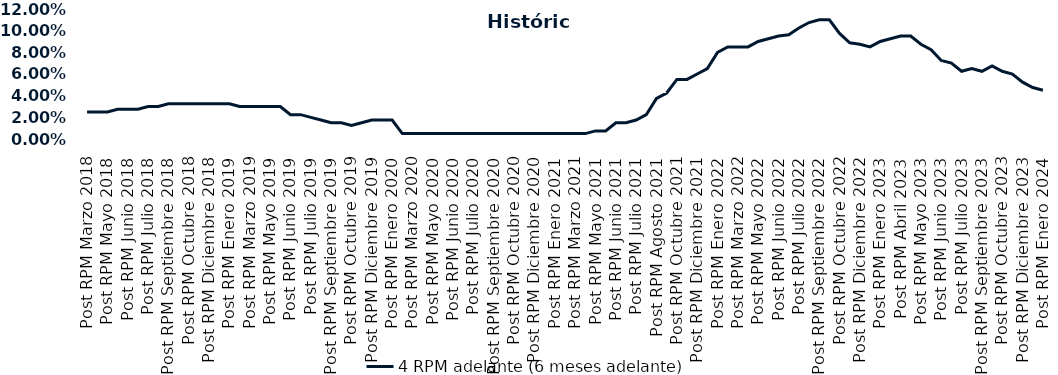
| Category | 4 RPM adelante (6 meses adelante) |
|---|---|
| Post RPM Marzo 2018 | 0.025 |
| Pre RPM Mayo 2018 | 0.025 |
| Post RPM Mayo 2018 | 0.025 |
| Pre RPM Junio 2018 | 0.028 |
| Post RPM Junio 2018 | 0.028 |
| Pre RPM Julio 2018 | 0.028 |
| Post RPM Julio 2018 | 0.03 |
| Pre RPM Septiembre 2018 | 0.03 |
| Post RPM Septiembre 2018 | 0.032 |
| Pre RPM Octubre 2018 | 0.032 |
| Post RPM Octubre 2018 | 0.032 |
| Pre RPM Diciembre 2018 | 0.032 |
| Post RPM Diciembre 2018 | 0.032 |
| Pre RPM Enero 2019 | 0.032 |
| Post RPM Enero 2019 | 0.032 |
| Pre RPM Marzo 2019 | 0.03 |
| Post RPM Marzo 2019 | 0.03 |
| Pre RPM Mayo 2019 | 0.03 |
| Post RPM Mayo 2019 | 0.03 |
| Pre RPM Junio 2019 | 0.03 |
| Post RPM Junio 2019 | 0.022 |
| Pre RPM Julio 2019 | 0.022 |
| Post RPM Julio 2019 | 0.02 |
| Pre RPM Septiembre 2019 | 0.018 |
| Post RPM Septiembre 2019 | 0.015 |
| Pre RPM Octubre 2019 | 0.015 |
| Post RPM Octubre 2019 | 0.012 |
| Pre RPM Diciembre 2019 | 0.015 |
| Post RPM Diciembre 2019 | 0.018 |
| Pre RPM Enero 2020 | 0.018 |
| Post RPM Enero 2020 | 0.018 |
| Pre RPM Marzo 2020 | 0.005 |
| Post RPM Marzo 2020 | 0.005 |
| Pre RPM Mayo 2020 | 0.005 |
| Post RPM Mayo 2020 | 0.005 |
| Pre RPM Junio 2020 | 0.005 |
| Post RPM Junio 2020 | 0.005 |
| Pre RPM Julio 2020 | 0.005 |
| Post RPM Julio 2020 | 0.005 |
| Pre RPM Septiembre 2020 | 0.005 |
| Post RPM Septiembre 2020 | 0.005 |
| Pre RPM Octubre 2020 | 0.005 |
| Post RPM Octubre 2020 | 0.005 |
| Pre RPM Diciembre 2020 | 0.005 |
| Post RPM Diciembre 2020 | 0.005 |
| Pre RPM Enero 2021 | 0.005 |
| Post RPM Enero 2021 | 0.005 |
| Pre RPM Marzo 2021 | 0.005 |
| Post RPM Marzo 2021 | 0.005 |
| Pre RPM Mayo 2021 | 0.005 |
| Post RPM Mayo 2021 | 0.008 |
| Pre RPM Junio 2021 | 0.008 |
| Post RPM Junio 2021 | 0.015 |
| Pre RPM Julio 2021 | 0.015 |
| Post RPM Julio 2021 | 0.018 |
| Pre RPM Agosto 2021 | 0.022 |
| Post RPM Agosto 2021 | 0.038 |
| Pre RPM Octubre 2021 | 0.042 |
| Post RPM Octubre 2021 | 0.055 |
| Pre RPM Diciembre 2021 | 0.055 |
| Post RPM Diciembre 2021 | 0.06 |
| Pre RPM Enero 2022 | 0.065 |
| Post RPM Enero 2022 | 0.08 |
| Pre RPM Marzo 2022 | 0.085 |
| Post RPM Marzo 2022 | 0.085 |
| Pre RPM Mayo 2022 | 0.085 |
| Post RPM Mayo 2022 | 0.09 |
| Pre RPM Junio 2022 | 0.092 |
| Post RPM Junio 2022 | 0.095 |
| Pre RPM Julio 2022 | 0.096 |
| Post RPM Julio 2022 | 0.102 |
| Pre RPM Septiembre 2022 | 0.108 |
| Post RPM Septiembre 2022 | 0.11 |
| Pre RPM Octubre 2022 | 0.11 |
| Post RPM Octubre 2022 | 0.098 |
| Pre RPM Diciembre 2022 | 0.089 |
| Post RPM Diciembre 2022 | 0.088 |
| Pre RPM Enero 2023 | 0.085 |
| Post RPM Enero 2023 | 0.09 |
| Pre RPM Abril 2023 | 0.092 |
| Post RPM Abril 2023 | 0.095 |
| Pre RPM Mayo 2023 | 0.095 |
| Post RPM Mayo 2023 | 0.088 |
| Pre RPM Junio 2023 | 0.082 |
| Post RPM Junio 2023 | 0.072 |
| Pre RPM Julio 2023 | 0.07 |
| Post RPM Julio 2023 | 0.062 |
| Pre RPM Septiembre 2023 | 0.065 |
| Post RPM Septiembre 2023 | 0.062 |
| Pre RPM Octubre 2023 | 0.068 |
| Post RPM Octubre 2023 | 0.062 |
| Pre RPM Diciembre 2023 | 0.06 |
| Post RPM Diciembre 2023 | 0.052 |
| Pre RPM Enero 2024 | 0.048 |
| Post RPM Enero 2024 | 0.045 |